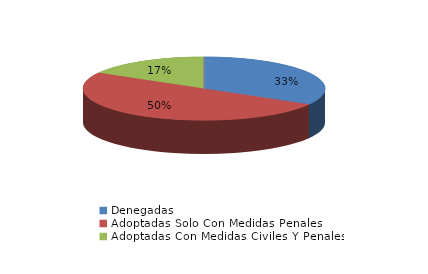
| Category | Series 0 |
|---|---|
| Denegadas | 2 |
| Adoptadas Solo Con Medidas Penales | 3 |
| Adoptadas Con Medidas Civiles Y Penales | 1 |
| Adoptadas Con Medidas Solo Civiles | 0 |